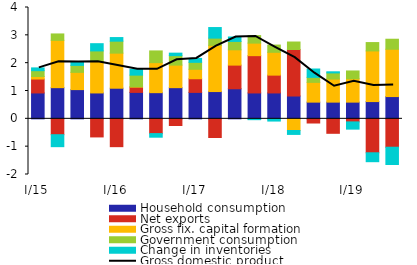
| Category | Household consumption | Net exports | Gross fix. capital formation | Government consumption | Change in inventories |
|---|---|---|---|---|---|
| I/15 | 0.93 | 0.5 | 0.09 | 0.21 | 0.1 |
| II | 1.12 | -0.57 | 1.7 | 0.23 | -0.43 |
| III | 1.05 | 0 | 0.62 | 0.25 | 0.12 |
| IV | 0.93 | -0.65 | 1.13 | 0.38 | 0.26 |
| I/16 | 1.1 | -1 | 1.26 | 0.43 | 0.13 |
| II | 0.95 | 0.19 | 0.01 | 0.42 | 0.21 |
| III | 0.94 | -0.53 | 1.08 | 0.42 | -0.13 |
| IV | 1.12 | -0.24 | 0.81 | 0.34 | 0.09 |
| I/17 | 0.95 | 0.49 | 0.34 | 0.25 | 0.14 |
| II | 0.98 | -0.67 | 1.66 | 0.26 | 0.38 |
| III | 1.08 | 0.85 | 0.55 | 0.3 | 0.16 |
| IV | 0.93 | 1.34 | 0.45 | 0.27 | -0.03 |
| I/18 | 0.93 | 0.64 | 0.82 | 0.26 | -0.08 |
| II | 0.82 | 1.67 | -0.42 | 0.27 | -0.14 |
| III | 0.6 | -0.15 | 0.71 | 0.18 | 0.3 |
| IV | 0.6 | -0.52 | 0.83 | 0.22 | 0.04 |
| I/19 | 0.6 | -0.11 | 0.84 | 0.28 | -0.26 |
| II | 0.62 | -1.22 | 1.82 | 0.3 | -0.32 |
| III | 0.8 | -1.02 | 1.7 | 0.36 | -0.62 |